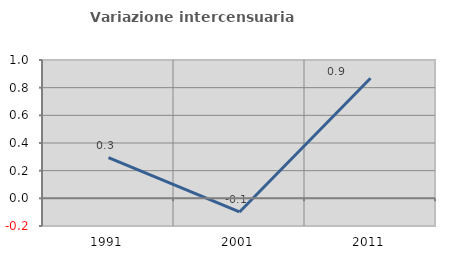
| Category | Variazione intercensuaria annua |
|---|---|
| 1991.0 | 0.295 |
| 2001.0 | -0.098 |
| 2011.0 | 0.868 |